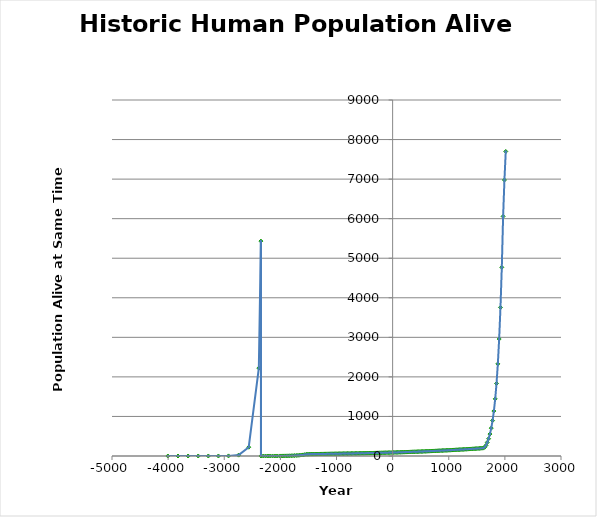
| Category | Series 0 |
|---|---|
| -4004.0 | 0 |
| -3824.0 | 0 |
| -3644.0 | 0 |
| -3464.0 | 0.002 |
| -3284.0 | 0.022 |
| -3104.0 | 0.222 |
| -2924.0 | 2.222 |
| -2744.0 | 22.222 |
| -2564.0 | 222.222 |
| -2384.0 | 2222.22 |
| -2347.0 | 5432.795 |
| -2346.0 | 0 |
| -2304.75 | 0 |
| -2263.5 | 0 |
| -2222.25 | 0.001 |
| -2181.0 | 0.002 |
| -2139.75 | 0.008 |
| -2098.5 | 0.033 |
| -2057.25 | 0.131 |
| -2014.0 | 0.552 |
| -1984.3 | 1.071 |
| -1954.6 | 1.717 |
| -1924.9 | 2.508 |
| -1895.2 | 3.429 |
| -1865.5 | 4.282 |
| -1835.8 | 5.353 |
| -1806.1 | 6.691 |
| -1776.4 | 8.363 |
| -1746.7 | 10.454 |
| -1717.0 | 13.068 |
| -1687.3 | 16.335 |
| -1657.6 | 20.418 |
| -1626.4 | 25.609 |
| -1595.2 | 28.319 |
| -1564.0 | 35.731 |
| -1532.8 | 45.17 |
| -1509.3 | 43.452 |
| -1485.8 | 47.006 |
| -1462.3 | 47.476 |
| -1438.8 | 47.95 |
| -1415.3 | 48.43 |
| -1391.8 | 48.914 |
| -1368.3 | 49.403 |
| -1344.8 | 49.897 |
| -1321.3 | 50.396 |
| -1297.8 | 50.9 |
| -1274.3 | 51.409 |
| -1250.8 | 51.923 |
| -1227.3 | 52.443 |
| -1203.8 | 52.967 |
| -1180.3 | 53.497 |
| -1156.8 | 54.032 |
| -1133.3 | 54.572 |
| -1109.8 | 55.118 |
| -1086.3 | 55.669 |
| -1062.8 | 56.226 |
| -1039.3 | 56.788 |
| -1015.8 | 57.356 |
| -992.299999999999 | 57.929 |
| -968.799999999999 | 58.509 |
| -945.299999999999 | 59.094 |
| -921.799999999999 | 59.685 |
| -898.299999999999 | 60.282 |
| -874.799999999999 | 60.884 |
| -851.299999999999 | 61.493 |
| -827.799999999999 | 62.108 |
| -804.299999999999 | 62.729 |
| -780.799999999999 | 63.356 |
| -757.299999999999 | 63.99 |
| -733.799999999999 | 64.63 |
| -710.299999999999 | 65.276 |
| -686.799999999999 | 65.929 |
| -663.299999999999 | 66.588 |
| -639.799999999999 | 67.254 |
| -616.299999999999 | 67.927 |
| -592.799999999999 | 68.606 |
| -569.299999999999 | 69.292 |
| -545.799999999999 | 69.985 |
| -522.299999999999 | 70.685 |
| -498.799999999999 | 71.392 |
| -475.299999999999 | 72.106 |
| -451.799999999999 | 72.827 |
| -428.299999999999 | 73.555 |
| -404.799999999999 | 74.29 |
| -381.299999999999 | 75.033 |
| -357.799999999999 | 75.784 |
| -334.299999999999 | 76.542 |
| -310.799999999999 | 77.307 |
| -287.299999999999 | 78.08 |
| -263.799999999999 | 78.861 |
| -240.299999999999 | 79.649 |
| -216.799999999999 | 80.446 |
| -193.299999999999 | 81.25 |
| -169.799999999999 | 82.063 |
| -146.299999999999 | 82.884 |
| -122.799999999999 | 83.712 |
| -99.2999999999993 | 84.549 |
| -75.7999999999993 | 85.395 |
| -52.2999999999993 | 86.249 |
| -28.7999999999993 | 87.111 |
| -5.29999999999927 | 87.983 |
| 18.2000000000007 | 88.862 |
| 41.7000000000007 | 89.811 |
| 65.2000000000007 | 90.829 |
| 88.7000000000007 | 91.919 |
| 112.200000000001 | 93.022 |
| 135.700000000001 | 94.139 |
| 159.200000000001 | 95.268 |
| 182.700000000001 | 96.411 |
| 206.200000000001 | 97.568 |
| 229.700000000001 | 98.739 |
| 253.200000000001 | 99.924 |
| 276.700000000001 | 101.123 |
| 300.200000000001 | 102.337 |
| 323.700000000001 | 103.565 |
| 347.200000000001 | 104.807 |
| 370.700000000001 | 106.065 |
| 394.200000000001 | 107.338 |
| 417.700000000001 | 108.626 |
| 441.200000000001 | 109.929 |
| 464.700000000001 | 111.249 |
| 488.200000000001 | 112.584 |
| 511.700000000001 | 113.935 |
| 535.200000000001 | 115.302 |
| 558.700000000001 | 116.685 |
| 582.200000000001 | 118.086 |
| 605.700000000001 | 119.503 |
| 629.200000000001 | 120.937 |
| 652.700000000001 | 122.388 |
| 676.200000000001 | 123.857 |
| 699.700000000001 | 125.343 |
| 723.200000000001 | 126.847 |
| 746.700000000001 | 128.369 |
| 770.200000000001 | 129.91 |
| 793.700000000001 | 131.469 |
| 817.200000000001 | 133.046 |
| 840.700000000001 | 134.643 |
| 864.200000000001 | 136.258 |
| 887.700000000001 | 137.894 |
| 911.200000000001 | 139.548 |
| 934.700000000001 | 141.223 |
| 958.200000000001 | 142.917 |
| 981.700000000001 | 144.632 |
| 1005.2 | 146.368 |
| 1028.7 | 148.125 |
| 1052.2 | 149.902 |
| 1075.7 | 151.701 |
| 1099.2 | 153.521 |
| 1122.7 | 155.363 |
| 1146.2 | 157.228 |
| 1169.7 | 159.115 |
| 1193.2 | 161.024 |
| 1216.7 | 162.956 |
| 1240.2 | 164.912 |
| 1263.7 | 166.891 |
| 1287.2 | 168.893 |
| 1310.7 | 170.92 |
| 1334.2 | 172.971 |
| 1357.7 | 175.047 |
| 1381.2 | 177.147 |
| 1404.7 | 179.273 |
| 1428.2 | 181.424 |
| 1451.7 | 183.601 |
| 1475.2 | 185.805 |
| 1498.7 | 188.034 |
| 1522.2 | 190.291 |
| 1545.7 | 192.574 |
| 1569.2 | 194.885 |
| 1592.7 | 197.224 |
| 1616.2 | 199.59 |
| 1639.7 | 222.47 |
| 1663.2 | 268.488 |
| 1686.7 | 344.095 |
| 1710.2 | 437.001 |
| 1733.7 | 554.991 |
| 1757.2 | 704.838 |
| 1780.7 | 895.145 |
| 1804.2 | 1136.834 |
| 1827.7 | 1443.779 |
| 1851.2 | 1833.6 |
| 1874.7 | 2328.671 |
| 1898.2 | 2957.413 |
| 1921.7 | 3755.914 |
| 1945.2 | 4770.011 |
| 1968.7 | 6057.914 |
| 1992.2 | 6976.775 |
| 2015.7 | 7698.638 |